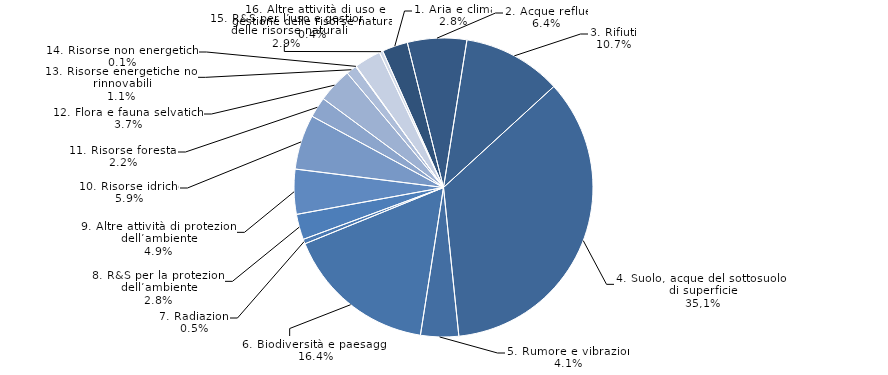
| Category | Series 0 |
|---|---|
| 1. Aria e clima | 0.028 |
| 2. Acque reflue | 0.064 |
| 3. Rifiuti | 0.107 |
| 4. Suolo, acque del sottosuolo e di superficie | 0.352 |
| 5. Rumore e vibrazioni | 0.041 |
| 6. Biodiversità e paesaggio | 0.164 |
| 7. Radiazioni | 0.005 |
| 8. R&S per la protezione dell’ambiente | 0.028 |
| 9. Altre attività di protezione dell’ambiente | 0.049 |
| 10. Risorse idriche | 0.059 |
| 11. Risorse forestali | 0.022 |
| 12. Flora e fauna selvatiche | 0.037 |
| 13. Risorse energetiche non rinnovabili | 0.011 |
| 14. Risorse non energetiche | 0.001 |
| 15. R&S per l’uso e gestione delle risorse naturali | 0.029 |
| 16. Altre attività di uso e gestione delle risorse naturali | 0.004 |